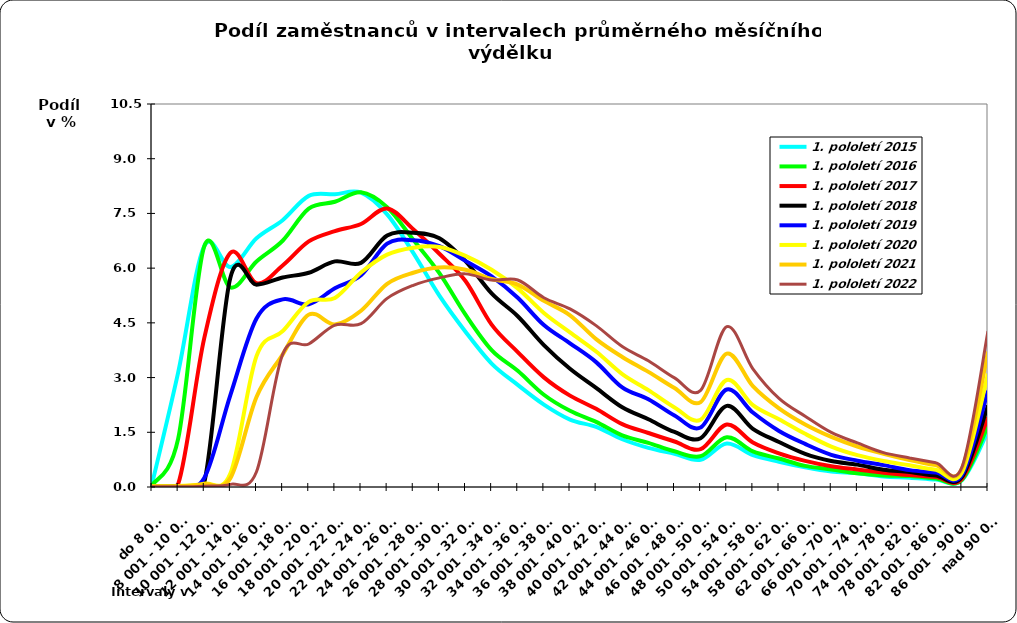
| Category | 1. pololetí 2015 | 1. pololetí 2016 | 1. pololetí 2017 | 1. pololetí 2018 | 1. pololetí 2019 | 1. pololetí 2020 | 1. pololetí 2021 | 1. pololetí 2022 |
|---|---|---|---|---|---|---|---|---|
| do 8 000 | 0.078 | 0.047 | 0.016 | 0.016 | 0.007 | 0.019 | 0.022 | 0.007 |
| 8 001 - 10 000 | 3.134 | 1.319 | 0.078 | 0.037 | 0.015 | 0.027 | 0.019 | 0.005 |
| 10 001 - 12 000 | 6.605 | 6.596 | 4.081 | 0.124 | 0.244 | 0.091 | 0.078 | 0.022 |
| 12 001 - 14 000 | 6.031 | 5.471 | 6.418 | 5.738 | 2.519 | 0.367 | 0.243 | 0.073 |
| 14 001 - 16 000 | 6.819 | 6.184 | 5.584 | 5.546 | 4.618 | 3.587 | 2.468 | 0.42 |
| 16 001 - 18 000 | 7.315 | 6.752 | 6.073 | 5.744 | 5.144 | 4.271 | 3.631 | 3.637 |
| 18 001 - 20 000 | 7.981 | 7.631 | 6.732 | 5.875 | 5.008 | 5.076 | 4.726 | 3.921 |
| 20 001 - 22 000 | 8.025 | 7.819 | 7.014 | 6.185 | 5.45 | 5.181 | 4.456 | 4.439 |
| 22 001 - 24 000 | 8.069 | 8.082 | 7.211 | 6.145 | 5.804 | 5.88 | 4.833 | 4.477 |
| 24 001 - 26 000 | 7.475 | 7.672 | 7.637 | 6.893 | 6.671 | 6.371 | 5.571 | 5.17 |
| 26 001 - 28 000 | 6.42 | 6.778 | 7.065 | 6.972 | 6.767 | 6.56 | 5.875 | 5.53 |
| 28 001 - 30 000 | 5.246 | 5.863 | 6.394 | 6.817 | 6.603 | 6.58 | 6.017 | 5.733 |
| 30 001 - 32 000 | 4.256 | 4.723 | 5.646 | 6.191 | 6.199 | 6.336 | 5.956 | 5.843 |
| 32 001 - 34 000 | 3.384 | 3.752 | 4.452 | 5.307 | 5.777 | 5.957 | 5.701 | 5.672 |
| 34 001 - 36 000 | 2.8 | 3.184 | 3.7 | 4.682 | 5.188 | 5.445 | 5.549 | 5.676 |
| 36 001 - 38 000 | 2.259 | 2.528 | 3.006 | 3.89 | 4.441 | 4.771 | 5.103 | 5.188 |
| 38 001 - 40 000 | 1.85 | 2.088 | 2.504 | 3.241 | 3.94 | 4.237 | 4.708 | 4.882 |
| 40 001 - 42 000 | 1.647 | 1.784 | 2.144 | 2.716 | 3.423 | 3.714 | 4.054 | 4.424 |
| 42 001 - 44 000 | 1.31 | 1.413 | 1.723 | 2.186 | 2.729 | 3.096 | 3.566 | 3.851 |
| 44 001 - 46 000 | 1.074 | 1.211 | 1.481 | 1.856 | 2.405 | 2.656 | 3.156 | 3.459 |
| 46 001 - 48 000 | 0.91 | 0.978 | 1.248 | 1.508 | 1.959 | 2.182 | 2.713 | 2.991 |
| 48 001 - 50 000 | 0.745 | 0.845 | 1.038 | 1.338 | 1.632 | 1.846 | 2.328 | 2.65 |
| 50 001 - 54 000 | 1.19 | 1.364 | 1.715 | 2.223 | 2.674 | 2.935 | 3.657 | 4.396 |
| 54 001 - 58 000 | 0.875 | 0.977 | 1.22 | 1.596 | 2.041 | 2.245 | 2.764 | 3.24 |
| 58 001 - 62 000 | 0.694 | 0.781 | 0.923 | 1.234 | 1.537 | 1.859 | 2.153 | 2.43 |
| 62 001 - 66 000 | 0.542 | 0.579 | 0.716 | 0.909 | 1.181 | 1.457 | 1.712 | 1.941 |
| 66 001 - 70 000 | 0.426 | 0.481 | 0.57 | 0.714 | 0.883 | 1.108 | 1.372 | 1.496 |
| 70 001 - 74 000 | 0.378 | 0.375 | 0.481 | 0.613 | 0.722 | 0.873 | 1.11 | 1.207 |
| 74 001 - 78 000 | 0.288 | 0.316 | 0.392 | 0.474 | 0.6 | 0.712 | 0.911 | 0.941 |
| 78 001 - 82 000 | 0.255 | 0.3 | 0.327 | 0.413 | 0.462 | 0.594 | 0.741 | 0.797 |
| 82 001 - 86 000 | 0.202 | 0.232 | 0.272 | 0.314 | 0.398 | 0.473 | 0.599 | 0.664 |
| 86 001 - 90 000 | 0.187 | 0.193 | 0.224 | 0.27 | 0.322 | 0.393 | 0.5 | 0.542 |
| nad 90 001 | 1.532 | 1.681 | 1.914 | 2.234 | 2.639 | 3.104 | 3.708 | 4.273 |